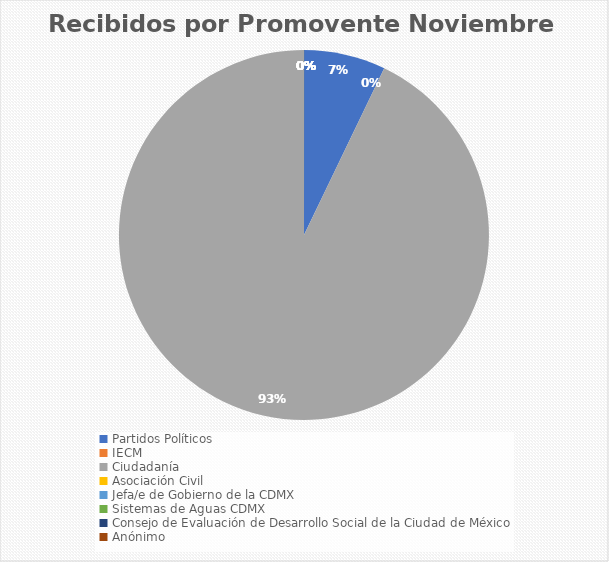
| Category | Recibidos por Promovente Noviembre |
|---|---|
| Partidos Políticos | 1 |
| IECM | 0 |
| Ciudadanía  | 13 |
| Asociación Civil | 0 |
| Jefa/e de Gobierno de la CDMX | 0 |
| Sistemas de Aguas CDMX | 0 |
| Consejo de Evaluación de Desarrollo Social de la Ciudad de México | 0 |
| Anónimo | 0 |